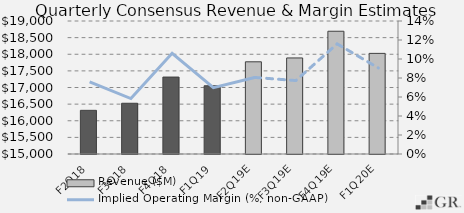
| Category | Revenue ($M) |
|---|---|
|  F2Q18  | 16313 |
|  F3Q18  | 16526 |
|  F4Q18  | 17314 |
|  F1Q19  | 17052 |
|  F2Q19E  | 17773 |
|  F3Q19E  | 17889 |
|  F4Q19E  | 18692 |
|  F1Q20E  | 18026 |